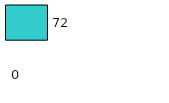
| Category | Series 0 | Series 1 |
|---|---|---|
| 0 | 0 | 72 |